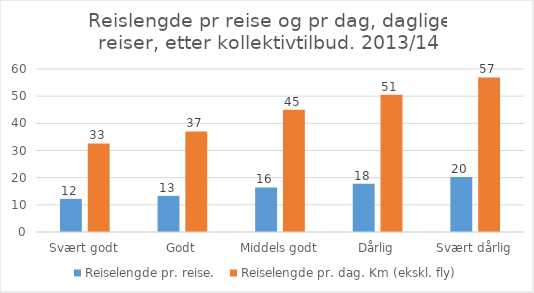
| Category | Reiselengde pr. reise.  | Reiselengde pr. dag. Km (ekskl. fly) |
|---|---|---|
| Svært godt | 12.2 | 32.6 |
| Godt | 13.3 | 37 |
| Middels godt | 16.4 | 45 |
| Dårlig | 17.8 | 50.5 |
| Svært dårlig | 20.2 | 56.9 |